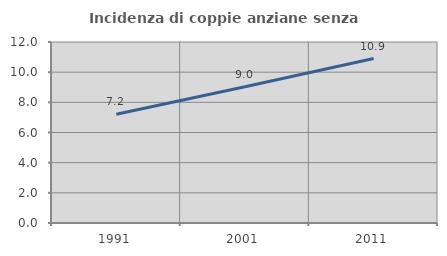
| Category | Incidenza di coppie anziane senza figli  |
|---|---|
| 1991.0 | 7.209 |
| 2001.0 | 9.029 |
| 2011.0 | 10.903 |